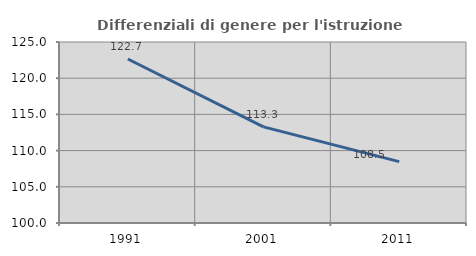
| Category | Differenziali di genere per l'istruzione superiore |
|---|---|
| 1991.0 | 122.652 |
| 2001.0 | 113.274 |
| 2011.0 | 108.472 |